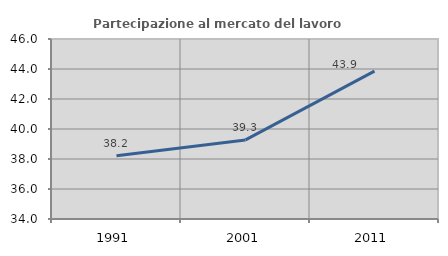
| Category | Partecipazione al mercato del lavoro  femminile |
|---|---|
| 1991.0 | 38.211 |
| 2001.0 | 39.272 |
| 2011.0 | 43.86 |